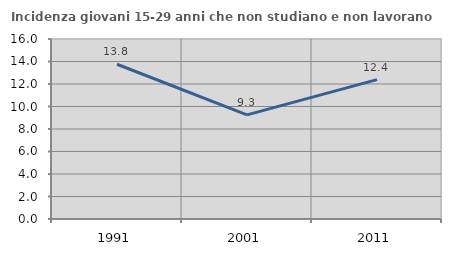
| Category | Incidenza giovani 15-29 anni che non studiano e non lavorano  |
|---|---|
| 1991.0 | 13.754 |
| 2001.0 | 9.26 |
| 2011.0 | 12.386 |